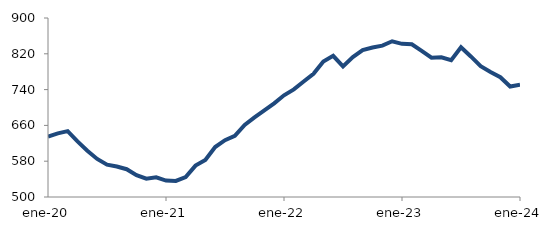
| Category | Series 0 |
|---|---|
| 2020-01-01 | 635.106 |
| 2020-02-01 | 642.14 |
| 2020-03-01 | 647.24 |
| 2020-04-01 | 624.208 |
| 2020-05-01 | 603.464 |
| 2020-06-01 | 585.1 |
| 2020-07-01 | 572.204 |
| 2020-08-01 | 568.185 |
| 2020-09-01 | 562.085 |
| 2020-10-01 | 548.898 |
| 2020-11-01 | 541.013 |
| 2020-12-01 | 544.038 |
| 2021-01-01 | 536.772 |
| 2021-02-01 | 535.938 |
| 2021-03-01 | 544.717 |
| 2021-04-01 | 570.16 |
| 2021-05-01 | 582.981 |
| 2021-06-01 | 611.684 |
| 2021-07-01 | 627.037 |
| 2021-08-01 | 636.642 |
| 2021-09-01 | 661.114 |
| 2021-10-01 | 677.889 |
| 2021-11-01 | 693.389 |
| 2021-12-01 | 709.343 |
| 2022-01-01 | 727.31 |
| 2022-02-01 | 740.539 |
| 2022-03-01 | 758.027 |
| 2022-04-01 | 775.241 |
| 2022-05-01 | 802.956 |
| 2022-06-01 | 815.434 |
| 2022-07-01 | 791.89 |
| 2022-08-01 | 812.76 |
| 2022-09-01 | 828.12 |
| 2022-10-01 | 834 |
| 2022-11-01 | 838.178 |
| 2022-12-01 | 847.954 |
| 2023-01-01 | 842.285 |
| 2023-02-01 | 841.25 |
| 2023-03-01 | 826.38 |
| 2023-04-01 | 811.394 |
| 2023-05-01 | 812.228 |
| 2023-06-01 | 805.926 |
| 2023-07-01 | 834.815 |
| 2023-08-01 | 814.103 |
| 2023-09-01 | 792.442 |
| 2023-10-01 | 779.206 |
| 2023-11-01 | 767.605 |
| 2023-12-01 | 746.855 |
| 2024-01-01 | 750.731 |